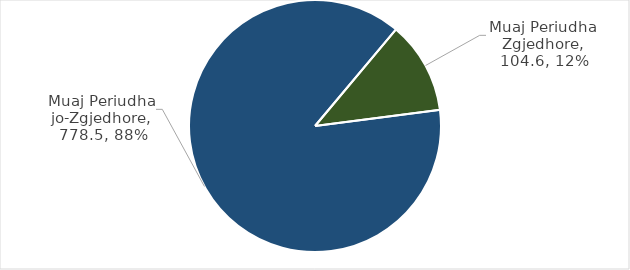
| Category | Total Grante |
|---|---|
| Muaj Periudha Zgjedhore | 104.558 |
| Muaj Periudha jo-Zgjedhore | 778.486 |